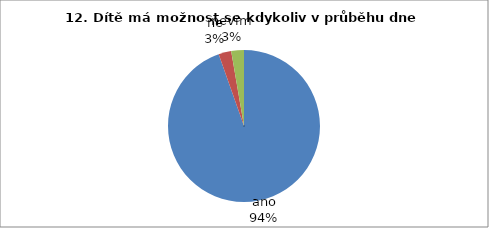
| Category | 12. Dítě má možnost se kdykoliv v průběhu dne napít. |
|---|---|
| ano | 35 |
| ne | 1 |
| nevím | 1 |